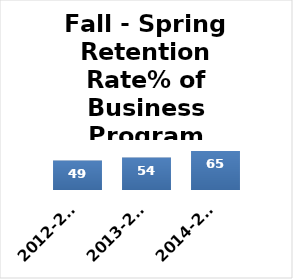
| Category | Series 0 |
|---|---|
| 2012-2013 (n=112) | 49 |
| 2013-2014 (n=125) | 54 |
| 2014-2015 (n=120) | 65 |